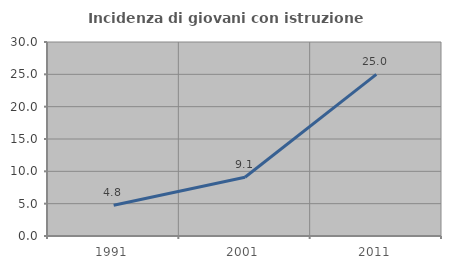
| Category | Incidenza di giovani con istruzione universitaria |
|---|---|
| 1991.0 | 4.762 |
| 2001.0 | 9.091 |
| 2011.0 | 25 |